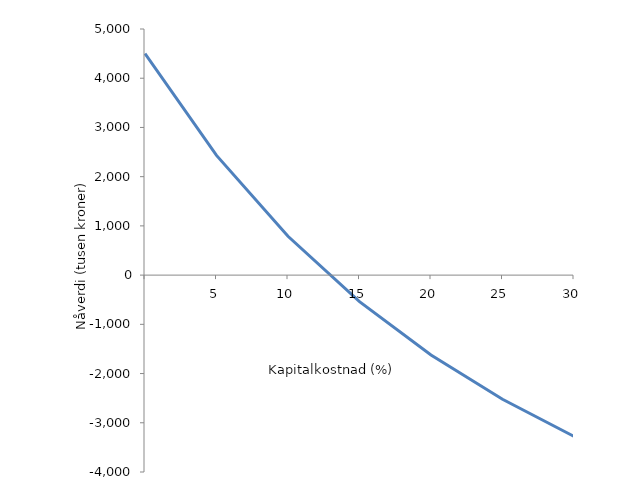
| Category | Nåverdi (tusen kroner)  | Series 1 | Series 2 |
|---|---|---|---|
| nan | 4500 |  |  |
| 5.0 | 2432.569 |  |  |
| 10.0 | 788.406 |  |  |
| 15.000000000000002 | -538.734 |  |  |
| 20.0 | -1624.389 |  |  |
| 25.0 | -2523.264 |  |  |
| 30.0 | -3275.649 |  |  |